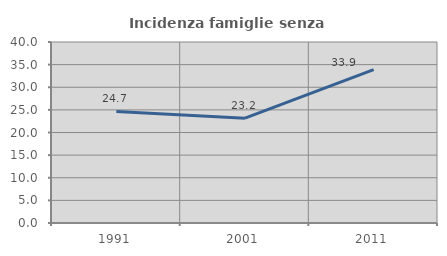
| Category | Incidenza famiglie senza nuclei |
|---|---|
| 1991.0 | 24.665 |
| 2001.0 | 23.166 |
| 2011.0 | 33.877 |